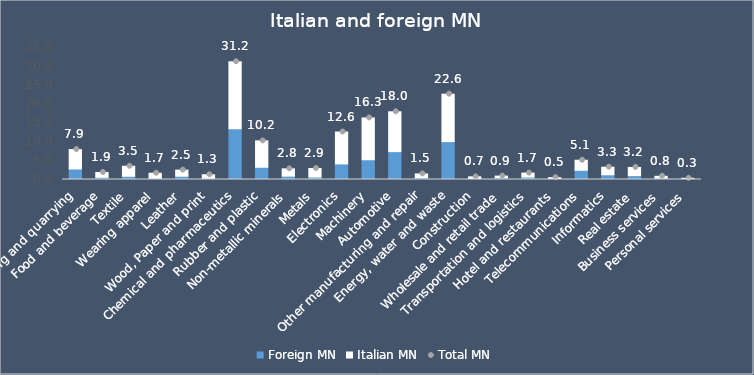
| Category | Foreign MN | Italian MN |
|---|---|---|
| 0 | 2.79 | 5.144 |
| 1 | 0.589 | 1.281 |
| 2 | 0.852 | 2.661 |
| 3 | 0.322 | 1.33 |
| 4 | 0.871 | 1.615 |
| 5 | 0.315 | 0.938 |
| 6 | 13.452 | 17.775 |
| 7 | 3.247 | 6.998 |
| 8 | 0.893 | 1.933 |
| 9 | 0.65 | 2.273 |
| 10 | 4.139 | 8.448 |
| 11 | 5.24 | 11.09 |
| 12 | 7.393 | 10.566 |
| 13 | 0.48 | 0.996 |
| 14 | 10.052 | 12.574 |
| 15 | 0.186 | 0.518 |
| 16 | 0.504 | 0.404 |
| 17 | 0.648 | 1.049 |
| 18 | 0.198 | 0.285 |
| 19 | 2.442 | 2.669 |
| 20 | 1.249 | 2.011 |
| 21 | 1.029 | 2.173 |
| 22 | 0.358 | 0.487 |
| 23 | 0.176 | 0.141 |